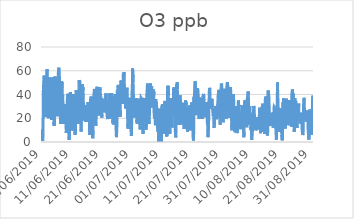
| Category | O3 |
|---|---|
| 01/06/2019 | 10.8 |
| 01/06/2019 | 8.7 |
| 01/06/2019 | 6.5 |
| 01/06/2019 | 5.7 |
| 01/06/2019 | 2.2 |
| 01/06/2019 | 1.1 |
| 01/06/2019 | 2 |
| 01/06/2019 | 4.7 |
| 01/06/2019 | 10.2 |
| 01/06/2019 | 24.5 |
| 01/06/2019 | 39.9 |
| 01/06/2019 | 45.3 |
| 01/06/2019 | 47.9 |
| 01/06/2019 | 48.5 |
| 01/06/2019 | 49.3 |
| 01/06/2019 | 52.4 |
| 01/06/2019 | 54.8 |
| 01/06/2019 | 55.9 |
| 01/06/2019 | 53.8 |
| 01/06/2019 | 48.4 |
| 01/06/2019 | 44.5 |
| 01/06/2019 | 40.9 |
| 01/06/2019 | 31.6 |
| 01/06/2019 | 30 |
| 02/06/2019 | 27 |
| 02/06/2019 | 22 |
| 02/06/2019 | 21 |
| 02/06/2019 | 21.1 |
| 02/06/2019 | 20.7 |
| 02/06/2019 | 22.1 |
| 02/06/2019 | 23.5 |
| 02/06/2019 | 24.1 |
| 02/06/2019 | 24.4 |
| 02/06/2019 | 24.2 |
| 02/06/2019 | 26 |
| 02/06/2019 | 36.6 |
| 02/06/2019 | 48 |
| 02/06/2019 | 52.4 |
| 02/06/2019 | 58.8 |
| 02/06/2019 | 58.8 |
| 02/06/2019 | 59.7 |
| 02/06/2019 | 61.3 |
| 02/06/2019 | 59.6 |
| 02/06/2019 | 56 |
| 02/06/2019 | 48.5 |
| 02/06/2019 | 42.3 |
| 02/06/2019 | 40 |
| 02/06/2019 | 36.1 |
| 03/06/2019 | 31.3 |
| 03/06/2019 | 27.7 |
| 03/06/2019 | 25.8 |
| 03/06/2019 | 24.1 |
| 03/06/2019 | 21.6 |
| 03/06/2019 | 20 |
| 03/06/2019 | 22.3 |
| 03/06/2019 | 24.3 |
| 03/06/2019 | 27.8 |
| 03/06/2019 | 39.9 |
| 03/06/2019 | 47.1 |
| 03/06/2019 | 52.8 |
| 03/06/2019 | 53.8 |
| 03/06/2019 | 52 |
| 03/06/2019 | 54.3 |
| 03/06/2019 | 51.5 |
| 03/06/2019 | 48.9 |
| 03/06/2019 | 30.4 |
| 03/06/2019 | 43.7 |
| 03/06/2019 | 52.3 |
| 03/06/2019 | 48.8 |
| 03/06/2019 | 41.8 |
| 03/06/2019 | 49.2 |
| 03/06/2019 | 46.1 |
| 04/06/2019 | 50.3 |
| 04/06/2019 | 44.8 |
| 04/06/2019 | 38.1 |
| 04/06/2019 | 29.6 |
| 04/06/2019 | 24.1 |
| 04/06/2019 | 18.5 |
| 04/06/2019 | 17.7 |
| 04/06/2019 | 23.3 |
| 04/06/2019 | 30.6 |
| 04/06/2019 | 35.6 |
| 04/06/2019 | 37.9 |
| 04/06/2019 | 42.6 |
| 04/06/2019 | 46 |
| 04/06/2019 | 46.6 |
| 04/06/2019 | 47.6 |
| 04/06/2019 | 50.6 |
| 04/06/2019 | 53.3 |
| 04/06/2019 | 54.4 |
| 04/06/2019 | 54 |
| 04/06/2019 | 50 |
| 04/06/2019 | 41.8 |
| 04/06/2019 | 35.7 |
| 04/06/2019 | 32.4 |
| 04/06/2019 | 27.1 |
| 05/06/2019 | 19.8 |
| 05/06/2019 | 15 |
| 05/06/2019 | 16.5 |
| 05/06/2019 | 13.5 |
| 05/06/2019 | 16.7 |
| 05/06/2019 | 19.6 |
| 05/06/2019 | 27 |
| 05/06/2019 | 35.8 |
| 05/06/2019 | 45.7 |
| 05/06/2019 | 50.5 |
| 05/06/2019 | 55.2 |
| 05/06/2019 | 51 |
| 05/06/2019 | 52.7 |
| 05/06/2019 | 51.8 |
| 05/06/2019 | 52.5 |
| 05/06/2019 | 52.1 |
| 05/06/2019 | 53.3 |
| 05/06/2019 | 52.5 |
| 05/06/2019 | 51.7 |
| 05/06/2019 | 51.5 |
| 05/06/2019 | 47.4 |
| 05/06/2019 | 40.5 |
| 05/06/2019 | 38.8 |
| 05/06/2019 | 38.7 |
| 06/06/2019 | 37.7 |
| 06/06/2019 | 34.8 |
| 06/06/2019 | 29.1 |
| 06/06/2019 | 26.3 |
| 06/06/2019 | 21.7 |
| 06/06/2019 | 22.3 |
| 06/06/2019 | 27.8 |
| 06/06/2019 | 37 |
| 06/06/2019 | 46.2 |
| 06/06/2019 | 49.2 |
| 06/06/2019 | 53.6 |
| 06/06/2019 | 56.1 |
| 06/06/2019 | 56.9 |
| 06/06/2019 | 59.5 |
| 06/06/2019 | 60.1 |
| 06/06/2019 | 60.2 |
| 06/06/2019 | 62.6 |
| 06/06/2019 | 60.4 |
| 06/06/2019 | 60.7 |
| 06/06/2019 | 61.1 |
| 06/06/2019 | 59.1 |
| 06/06/2019 | 52.4 |
| 06/06/2019 | 41.9 |
| 06/06/2019 | 39.4 |
| 07/06/2019 | 38.2 |
| 07/06/2019 | 38.1 |
| 07/06/2019 | 33.2 |
| 07/06/2019 | 26.7 |
| 07/06/2019 | 24.4 |
| 07/06/2019 | 18.9 |
| 07/06/2019 | 15.2 |
| 07/06/2019 | 18.5 |
| 07/06/2019 | 17.2 |
| 07/06/2019 | 29.5 |
| 07/06/2019 | 37.4 |
| 07/06/2019 | 44.7 |
| 07/06/2019 | 51.1 |
| 07/06/2019 | 50 |
| 07/06/2019 | 48.1 |
| 07/06/2019 | 45.7 |
| 07/06/2019 | 45 |
| 07/06/2019 | 49.7 |
| 07/06/2019 | 50.7 |
| 07/06/2019 | 48.4 |
| 07/06/2019 | 40.3 |
| 07/06/2019 | 41 |
| 07/06/2019 | 38.7 |
| 07/06/2019 | 39.7 |
| 08/06/2019 | 38.2 |
| 08/06/2019 | 34.2 |
| 08/06/2019 | 31.7 |
| 08/06/2019 | 22.2 |
| 08/06/2019 | 15.4 |
| 08/06/2019 | 16.1 |
| 08/06/2019 | 16.7 |
| 08/06/2019 | 15.6 |
| 08/06/2019 | 15.4 |
| 08/06/2019 | 15.2 |
| 08/06/2019 | 14.9 |
| 08/06/2019 | 15.7 |
| 08/06/2019 | 16.1 |
| 08/06/2019 | 16.3 |
| 08/06/2019 | 17.3 |
| 08/06/2019 | 19.5 |
| 08/06/2019 | 26.1 |
| 08/06/2019 | 29.2 |
| 08/06/2019 | 31.7 |
| 08/06/2019 | 29.3 |
| 08/06/2019 | 25.6 |
| 08/06/2019 | 24 |
| 08/06/2019 | 22.9 |
| 08/06/2019 | 23.3 |
| 09/06/2019 | 20.3 |
| 09/06/2019 | 17.9 |
| 09/06/2019 | 16 |
| 09/06/2019 | 12.6 |
| 09/06/2019 | 8.5 |
| 09/06/2019 | 7.6 |
| 09/06/2019 | 8 |
| 09/06/2019 | 12.8 |
| 09/06/2019 | 20 |
| 09/06/2019 | 23.7 |
| 09/06/2019 | 29.3 |
| 09/06/2019 | 31.6 |
| 09/06/2019 | 31.9 |
| 09/06/2019 | 34.4 |
| 09/06/2019 | 38.8 |
| 09/06/2019 | 40.6 |
| 09/06/2019 | 40.5 |
| 09/06/2019 | 40.8 |
| 09/06/2019 | 40.3 |
| 09/06/2019 | 38.5 |
| 09/06/2019 | 33.9 |
| 09/06/2019 | 28.3 |
| 09/06/2019 | 21.4 |
| 09/06/2019 | 20.1 |
| 10/06/2019 | 15.7 |
| 10/06/2019 | 9.5 |
| 10/06/2019 | 4.9 |
| 10/06/2019 | 4.1 |
| 10/06/2019 | 1.7 |
| 10/06/2019 | 4.4 |
| 10/06/2019 | 4.8 |
| 10/06/2019 | 6.3 |
| 10/06/2019 | 13.8 |
| 10/06/2019 | 13.5 |
| 10/06/2019 | 23.2 |
| 10/06/2019 | 33 |
| 10/06/2019 | 37.1 |
| 10/06/2019 | 38.8 |
| 10/06/2019 | 42 |
| 10/06/2019 | 41.2 |
| 10/06/2019 | 41.6 |
| 10/06/2019 | 41.9 |
| 10/06/2019 | 41.7 |
| 10/06/2019 | 35.3 |
| 10/06/2019 | 32.1 |
| 10/06/2019 | 35.6 |
| 10/06/2019 | 34.1 |
| 10/06/2019 | 32.9 |
| 11/06/2019 | 30.9 |
| 11/06/2019 | 23.7 |
| 11/06/2019 | 21.9 |
| 11/06/2019 | 24.7 |
| 11/06/2019 | 15.5 |
| 11/06/2019 | 9.6 |
| 11/06/2019 | 20.9 |
| 11/06/2019 | 21.2 |
| 11/06/2019 | 27.5 |
| 11/06/2019 | 29.4 |
| 11/06/2019 | 31.9 |
| 11/06/2019 | 34.8 |
| 11/06/2019 | 38.7 |
| 11/06/2019 | 38.7 |
| 11/06/2019 | 40.2 |
| 11/06/2019 | 40.2 |
| 11/06/2019 | 36.8 |
| 11/06/2019 | 36.6 |
| 11/06/2019 | 37.6 |
| 11/06/2019 | 36.1 |
| 11/06/2019 | 31.6 |
| 11/06/2019 | 26.1 |
| 11/06/2019 | 25 |
| 11/06/2019 | 20.9 |
| 12/06/2019 | 15.1 |
| 12/06/2019 | 15.2 |
| 12/06/2019 | 11.9 |
| 12/06/2019 | 7.8 |
| 12/06/2019 | 6.1 |
| 12/06/2019 | 5.3 |
| 12/06/2019 | 6.6 |
| 12/06/2019 | 10.1 |
| 12/06/2019 | 20.3 |
| 12/06/2019 | 29.2 |
| 12/06/2019 | 37.5 |
| 12/06/2019 | 39.7 |
| 12/06/2019 | 41 |
| 12/06/2019 | 41.6 |
| 12/06/2019 | 43.8 |
| 12/06/2019 | 40.9 |
| 12/06/2019 | 39.9 |
| 12/06/2019 | 39.4 |
| 12/06/2019 | 36.8 |
| 12/06/2019 | 36.5 |
| 12/06/2019 | 35.8 |
| 12/06/2019 | 33.9 |
| 12/06/2019 | 31.6 |
| 12/06/2019 | 34.2 |
| 13/06/2019 | 30.6 |
| 13/06/2019 | 29.9 |
| 13/06/2019 | 30.7 |
| 13/06/2019 | 24.2 |
| 13/06/2019 | 19 |
| 13/06/2019 | 15.3 |
| 13/06/2019 | 15.8 |
| 13/06/2019 | 20.2 |
| 13/06/2019 | 23.2 |
| 13/06/2019 | 26.9 |
| 13/06/2019 | 37.4 |
| 13/06/2019 | 41.3 |
| 13/06/2019 | 44.4 |
| 13/06/2019 | 52.2 |
| 13/06/2019 | 52.1 |
| 13/06/2019 | 50.2 |
| 13/06/2019 | 49.1 |
| 13/06/2019 | 51.7 |
| 13/06/2019 | 44.3 |
| 13/06/2019 | 39.3 |
| 13/06/2019 | 35.5 |
| 13/06/2019 | 31.5 |
| 13/06/2019 | 30.8 |
| 13/06/2019 | 28.1 |
| 14/06/2019 | 30.5 |
| 14/06/2019 | 27.4 |
| 14/06/2019 | 24.7 |
| 14/06/2019 | 19.7 |
| 14/06/2019 | 14.5 |
| 14/06/2019 | 8.9 |
| 14/06/2019 | 10.8 |
| 14/06/2019 | 18.4 |
| 14/06/2019 | 25.6 |
| 14/06/2019 | 27.1 |
| 14/06/2019 | 37.6 |
| 14/06/2019 | 34.8 |
| 14/06/2019 | 39.5 |
| 14/06/2019 | 40 |
| 14/06/2019 | 37.7 |
| 14/06/2019 | 46 |
| 14/06/2019 | 48.6 |
| 14/06/2019 | 42.3 |
| 14/06/2019 | 42.5 |
| 14/06/2019 | 46.3 |
| 14/06/2019 | 46.5 |
| 14/06/2019 | 44.1 |
| 14/06/2019 | 36.5 |
| 14/06/2019 | 34.7 |
| 15/06/2019 | 26.3 |
| 15/06/2019 | 33.1 |
| 15/06/2019 | 24.1 |
| 15/06/2019 | 19 |
| 15/06/2019 | 18.1 |
| 15/06/2019 | 23.2 |
| 15/06/2019 | 22.5 |
| 15/06/2019 | 20.3 |
| 15/06/2019 | 24.9 |
| 15/06/2019 | 29.5 |
| 15/06/2019 | 31.2 |
| 15/06/2019 | 31.2 |
| 15/06/2019 | 28.9 |
| 15/06/2019 | 23.1 |
| 15/06/2019 | 25.3 |
| 15/06/2019 | 24.7 |
| 15/06/2019 | 19.7 |
| 15/06/2019 | 17.8 |
| 15/06/2019 | 16.9 |
| 15/06/2019 | 18.7 |
| 15/06/2019 | 20.4 |
| 15/06/2019 | 24.8 |
| 15/06/2019 | 26.4 |
| 15/06/2019 | 26.6 |
| 16/06/2019 | 21.9 |
| 16/06/2019 | 21.1 |
| 16/06/2019 | 19.3 |
| 16/06/2019 | 27.9 |
| 16/06/2019 | 28.4 |
| 16/06/2019 | 20.2 |
| 16/06/2019 | 17.1 |
| 16/06/2019 | 22.9 |
| 16/06/2019 | 25.1 |
| 16/06/2019 | 30.1 |
| 16/06/2019 | 28.7 |
| 16/06/2019 | 30.4 |
| 16/06/2019 | 31.8 |
| 16/06/2019 | 33.6 |
| 16/06/2019 | 32.1 |
| 16/06/2019 | 32.4 |
| 16/06/2019 | 32.5 |
| 16/06/2019 | 32.3 |
| 16/06/2019 | 32.8 |
| 16/06/2019 | 32.1 |
| 16/06/2019 | 29 |
| 16/06/2019 | 24 |
| 16/06/2019 | 23.4 |
| 16/06/2019 | 28.7 |
| 17/06/2019 | 30.4 |
| 17/06/2019 | 20.2 |
| 17/06/2019 | 9 |
| 17/06/2019 | 5.9 |
| 17/06/2019 | 5.2 |
| 17/06/2019 | 7.7 |
| 17/06/2019 | 9.4 |
| 17/06/2019 | 13.6 |
| 17/06/2019 | 23.4 |
| 17/06/2019 | 31.6 |
| 17/06/2019 | 36.1 |
| 17/06/2019 | 34 |
| 17/06/2019 | 35 |
| 17/06/2019 | 35.8 |
| 17/06/2019 | 38.3 |
| 17/06/2019 | 37.6 |
| 17/06/2019 | 36 |
| 17/06/2019 | 37.8 |
| 17/06/2019 | 37.6 |
| 17/06/2019 | 36.5 |
| 17/06/2019 | 32.9 |
| 17/06/2019 | 30.3 |
| 17/06/2019 | 22.5 |
| 17/06/2019 | 18.6 |
| 18/06/2019 | 12 |
| 18/06/2019 | 11.4 |
| 18/06/2019 | 9.3 |
| 18/06/2019 | 3.1 |
| 18/06/2019 | 2.3 |
| 18/06/2019 | 3.7 |
| 18/06/2019 | 10 |
| 18/06/2019 | 19.2 |
| 18/06/2019 | 22.4 |
| 18/06/2019 | 29.2 |
| 18/06/2019 | 31.9 |
| 18/06/2019 | 35.6 |
| 18/06/2019 | 38.9 |
| 18/06/2019 | 39.1 |
| 18/06/2019 | 41.1 |
| 18/06/2019 | 42.6 |
| 18/06/2019 | 43.2 |
| 18/06/2019 | 44.7 |
| 18/06/2019 | 44.5 |
| 18/06/2019 | 43.5 |
| 18/06/2019 | 39 |
| 18/06/2019 | 29.1 |
| 18/06/2019 | 24.5 |
| 18/06/2019 | 20.8 |
| 19/06/2019 | 20.8 |
| 19/06/2019 | 19.7 |
| 19/06/2019 | 17.9 |
| 19/06/2019 | 16 |
| 19/06/2019 | 13.7 |
| 19/06/2019 | 13.6 |
| 19/06/2019 | 14.8 |
| 19/06/2019 | 19.3 |
| 19/06/2019 | 28.2 |
| 19/06/2019 | 38.6 |
| 19/06/2019 | 41.3 |
| 19/06/2019 | 42.7 |
| 19/06/2019 | 45.4 |
| 19/06/2019 | 45.7 |
| 19/06/2019 | 46.1 |
| 19/06/2019 | 46.5 |
| 19/06/2019 | 43.6 |
| 19/06/2019 | 43.9 |
| 19/06/2019 | 46.2 |
| 19/06/2019 | 44.1 |
| 19/06/2019 | 40.4 |
| 19/06/2019 | 35.4 |
| 19/06/2019 | 31.3 |
| 19/06/2019 | 29.3 |
| 20/06/2019 | 25.9 |
| 20/06/2019 | 24.1 |
| 20/06/2019 | 23.9 |
| 20/06/2019 | 24.1 |
| 20/06/2019 | 22.3 |
| 20/06/2019 | 24.8 |
| 20/06/2019 | 23.6 |
| 20/06/2019 | 26.8 |
| 20/06/2019 | 37.5 |
| 20/06/2019 | 36.6 |
| 20/06/2019 | 37.8 |
| 20/06/2019 | 44.6 |
| 20/06/2019 | 43.7 |
| 20/06/2019 | 46.1 |
| 20/06/2019 | 42.3 |
| 20/06/2019 | 39.7 |
| 20/06/2019 | 41.2 |
| 20/06/2019 | 41.6 |
| 20/06/2019 | 39.5 |
| 20/06/2019 | 40.7 |
| 20/06/2019 | 34.9 |
| 20/06/2019 | 28.1 |
| 20/06/2019 | 29.9 |
| 20/06/2019 | 29.3 |
| 21/06/2019 | 34.8 |
| 21/06/2019 | 31.5 |
| 21/06/2019 | 27.1 |
| 21/06/2019 | 23.8 |
| 21/06/2019 | 22.1 |
| 21/06/2019 | 20.5 |
| 21/06/2019 | 22.5 |
| 21/06/2019 | 23.8 |
| 21/06/2019 | 26.6 |
| 21/06/2019 | 29.5 |
| 21/06/2019 | 30.2 |
| 21/06/2019 | 30.3 |
| 21/06/2019 | 27.4 |
| 21/06/2019 | 26 |
| 21/06/2019 | 26.1 |
| 21/06/2019 | 26.4 |
| 21/06/2019 | 28.9 |
| 21/06/2019 | 35.6 |
| 21/06/2019 | 34.5 |
| 21/06/2019 | 36.5 |
| 21/06/2019 | 32.7 |
| 21/06/2019 | 25 |
| 21/06/2019 | 27.5 |
| 21/06/2019 | 29 |
| 22/06/2019 | 31 |
| 22/06/2019 | 31 |
| 22/06/2019 | 31.6 |
| 22/06/2019 | 32.2 |
| 22/06/2019 | 34 |
| 22/06/2019 | 33.8 |
| 22/06/2019 | 31.3 |
| 22/06/2019 | 30.6 |
| 22/06/2019 | 33.4 |
| 22/06/2019 | 31.9 |
| 22/06/2019 | 32 |
| 22/06/2019 | 36.2 |
| 22/06/2019 | 37.1 |
| 22/06/2019 | 39.7 |
| 22/06/2019 | 40.9 |
| 22/06/2019 | 40.7 |
| 22/06/2019 | 29.1 |
| 22/06/2019 | 27.8 |
| 22/06/2019 | 24.3 |
| 22/06/2019 | 25.6 |
| 22/06/2019 | 34 |
| 22/06/2019 | 28.7 |
| 22/06/2019 | 27.5 |
| 22/06/2019 | 26.1 |
| 23/06/2019 | 23.6 |
| 23/06/2019 | 21.2 |
| 23/06/2019 | 22.2 |
| 23/06/2019 | 21.8 |
| 23/06/2019 | 19.3 |
| 23/06/2019 | 19.6 |
| 23/06/2019 | 20.1 |
| 23/06/2019 | 23.2 |
| 23/06/2019 | 26.7 |
| 23/06/2019 | 29.7 |
| 23/06/2019 | 31.3 |
| 23/06/2019 | 32.7 |
| 23/06/2019 | 33.9 |
| 23/06/2019 | 34.7 |
| 23/06/2019 | 35.2 |
| 23/06/2019 | 37.3 |
| 23/06/2019 | 40.9 |
| 23/06/2019 | 41.4 |
| 23/06/2019 | 39.8 |
| 23/06/2019 | 40.3 |
| 23/06/2019 | 39.1 |
| 23/06/2019 | 34.1 |
| 23/06/2019 | 30.1 |
| 23/06/2019 | 26.4 |
| 24/06/2019 | 19.5 |
| 24/06/2019 | 23.5 |
| 24/06/2019 | 23.8 |
| 24/06/2019 | 27.1 |
| 24/06/2019 | 31.5 |
| 24/06/2019 | 26.6 |
| 24/06/2019 | 22.6 |
| 24/06/2019 | 27.1 |
| 24/06/2019 | 29.1 |
| 24/06/2019 | 27.7 |
| 24/06/2019 | 24.6 |
| 24/06/2019 | 30.1 |
| 24/06/2019 | 40 |
| 24/06/2019 | 41 |
| 24/06/2019 | 34.9 |
| 24/06/2019 | 34.7 |
| 24/06/2019 | 35.4 |
| 24/06/2019 | 36.2 |
| 24/06/2019 | 32.1 |
| 24/06/2019 | 31.9 |
| 24/06/2019 | 32.5 |
| 24/06/2019 | 24.2 |
| 24/06/2019 | 20.3 |
| 24/06/2019 | 16.9 |
| 25/06/2019 | 18.6 |
| 25/06/2019 | 15.5 |
| 25/06/2019 | 16.9 |
| 25/06/2019 | 15.9 |
| 25/06/2019 | 14.7 |
| 25/06/2019 | 14.1 |
| 25/06/2019 | 15.7 |
| 25/06/2019 | 21.9 |
| 25/06/2019 | 25.8 |
| 25/06/2019 | 29.3 |
| 25/06/2019 | 33 |
| 25/06/2019 | 35.3 |
| 25/06/2019 | 37.1 |
| 25/06/2019 | 38.4 |
| 25/06/2019 | 37.1 |
| 25/06/2019 | 36.9 |
| 25/06/2019 | 38.4 |
| 25/06/2019 | 40.4 |
| 25/06/2019 | 41.1 |
| 25/06/2019 | 38.9 |
| 25/06/2019 | 36.9 |
| 25/06/2019 | 24.3 |
| 25/06/2019 | 17.7 |
| 25/06/2019 | 15 |
| 26/06/2019 | 13.3 |
| 26/06/2019 | 10.6 |
| 26/06/2019 | 7.9 |
| 26/06/2019 | 5.3 |
| 26/06/2019 | 4.1 |
| 26/06/2019 | 6.8 |
| 26/06/2019 | 8.5 |
| 26/06/2019 | 11.3 |
| 26/06/2019 | 14.9 |
| 26/06/2019 | 33.7 |
| 26/06/2019 | 39.3 |
| 26/06/2019 | 43 |
| 26/06/2019 | 43.3 |
| 26/06/2019 | 43.3 |
| 26/06/2019 | 43.1 |
| 26/06/2019 | 43.4 |
| 26/06/2019 | 44.2 |
| 26/06/2019 | 46.4 |
| 26/06/2019 | 48.1 |
| 26/06/2019 | 45.5 |
| 26/06/2019 | 40.5 |
| 26/06/2019 | 28.1 |
| 26/06/2019 | 32.1 |
| 26/06/2019 | 29.5 |
| 27/06/2019 | 30 |
| 27/06/2019 | 33.4 |
| 27/06/2019 | 34.4 |
| 27/06/2019 | 31.6 |
| 27/06/2019 | 28.7 |
| 27/06/2019 | 25.7 |
| 27/06/2019 | 21.3 |
| 27/06/2019 | 26.1 |
| 27/06/2019 | 23.9 |
| 27/06/2019 | 24.4 |
| 27/06/2019 | 21.4 |
| 27/06/2019 | 26.4 |
| 27/06/2019 | 38.1 |
| 27/06/2019 | 41.2 |
| 27/06/2019 | 45.6 |
| 27/06/2019 | 49.6 |
| 27/06/2019 | 51.8 |
| 27/06/2019 | 51.4 |
| 27/06/2019 | 50.5 |
| 27/06/2019 | 46.9 |
| 27/06/2019 | 41.5 |
| 27/06/2019 | 35.8 |
| 27/06/2019 | 34.5 |
| 27/06/2019 | 34.2 |
| 28/06/2019 | 32.1 |
| 28/06/2019 | 32.7 |
| 28/06/2019 | 33 |
| 28/06/2019 | 42.6 |
| 28/06/2019 | 35.6 |
| 28/06/2019 | 36 |
| 28/06/2019 | 33.7 |
| 28/06/2019 | 32.9 |
| 28/06/2019 | 36.2 |
| 28/06/2019 | 40 |
| 28/06/2019 | 48.7 |
| 28/06/2019 | 57.1 |
| 28/06/2019 | 56.8 |
| 28/06/2019 | 56.8 |
| 28/06/2019 | 55.5 |
| 28/06/2019 | 54.7 |
| 28/06/2019 | 57 |
| 28/06/2019 | 59 |
| 28/06/2019 | 56.9 |
| 28/06/2019 | 55 |
| 28/06/2019 | 49.3 |
| 28/06/2019 | 45.7 |
| 28/06/2019 | 43.7 |
| 28/06/2019 | 38.7 |
| 29/06/2019 | 34.3 |
| 29/06/2019 | 32.3 |
| 29/06/2019 | 36.5 |
| 29/06/2019 | 35.9 |
| 29/06/2019 | 35 |
| 29/06/2019 | 31.4 |
| 29/06/2019 | 28.3 |
| 29/06/2019 | 28.8 |
| 29/06/2019 | 35.2 |
| 29/06/2019 | 33.8 |
| 29/06/2019 | 38.4 |
| 29/06/2019 | 42.3 |
| 29/06/2019 | 41.8 |
| 29/06/2019 | 42.3 |
| 29/06/2019 | 37.1 |
| 29/06/2019 | 37.7 |
| 29/06/2019 | 44.4 |
| 29/06/2019 | 45.7 |
| 29/06/2019 | 44.2 |
| 29/06/2019 | 35.7 |
| 29/06/2019 | 35.1 |
| 29/06/2019 | 33.1 |
| 29/06/2019 | 20.5 |
| 29/06/2019 | 19.4 |
| 30/06/2019 | 12.9 |
| 30/06/2019 | 14.6 |
| 30/06/2019 | 12.9 |
| 30/06/2019 | 11.1 |
| 30/06/2019 | 12.6 |
| 30/06/2019 | 17.4 |
| 30/06/2019 | 19.3 |
| 30/06/2019 | 19.4 |
| 30/06/2019 | 24.5 |
| 30/06/2019 | 31.4 |
| 30/06/2019 | 33.3 |
| 30/06/2019 | 35.5 |
| 30/06/2019 | 34.8 |
| 30/06/2019 | 34.8 |
| 30/06/2019 | 36.2 |
| 30/06/2019 | 37.2 |
| 30/06/2019 | 35.1 |
| 30/06/2019 | 35.8 |
| 30/06/2019 | 36 |
| 30/06/2019 | 33.1 |
| 30/06/2019 | 28.6 |
| 30/06/2019 | 23.8 |
| 30/06/2019 | 20.9 |
| 30/06/2019 | 18.3 |
| 01/07/2019 | 12.4 |
| 01/07/2019 | 12.5 |
| 01/07/2019 | 9.4 |
| 01/07/2019 | 8.4 |
| 01/07/2019 | 7.4 |
| 01/07/2019 | 5.2 |
| 01/07/2019 | 8.9 |
| 01/07/2019 | 13.1 |
| 01/07/2019 | 27.8 |
| 01/07/2019 | 32.5 |
| 01/07/2019 | 39.6 |
| 01/07/2019 | 42.9 |
| 01/07/2019 | 44.5 |
| 01/07/2019 | 47.5 |
| 01/07/2019 | 54.4 |
| 01/07/2019 | 62 |
| 01/07/2019 | 55.4 |
| 01/07/2019 | 56.7 |
| 01/07/2019 | 56.1 |
| 01/07/2019 | 50.5 |
| 01/07/2019 | 43.7 |
| 01/07/2019 | 44.2 |
| 01/07/2019 | 43 |
| 01/07/2019 | 36.7 |
| 02/07/2019 | 29.6 |
| 02/07/2019 | 27.1 |
| 02/07/2019 | 24.9 |
| 02/07/2019 | 23.6 |
| 02/07/2019 | 20.7 |
| 02/07/2019 | 25.3 |
| 02/07/2019 | 26.4 |
| 02/07/2019 | 25.5 |
| 02/07/2019 | 25.2 |
| 02/07/2019 | 33.9 |
| 02/07/2019 | 35 |
| 02/07/2019 | 33.8 |
| 02/07/2019 | 33.8 |
| 02/07/2019 | 33.4 |
| 02/07/2019 | 34.3 |
| 02/07/2019 | 35 |
| 02/07/2019 | 36.9 |
| 02/07/2019 | 37.6 |
| 02/07/2019 | 35.1 |
| 02/07/2019 | 34 |
| 02/07/2019 | 32.4 |
| 02/07/2019 | 26.3 |
| 02/07/2019 | 25.6 |
| 02/07/2019 | 24.7 |
| 03/07/2019 | 25.2 |
| 03/07/2019 | 19.6 |
| 03/07/2019 | 17.3 |
| 03/07/2019 | 18.3 |
| 03/07/2019 | 15.5 |
| 03/07/2019 | 16.3 |
| 03/07/2019 | 16.3 |
| 03/07/2019 | 19.7 |
| 03/07/2019 | 17.6 |
| 03/07/2019 | 25.8 |
| 03/07/2019 | 32.1 |
| 03/07/2019 | 35.1 |
| 03/07/2019 | 36.5 |
| 03/07/2019 | 35.2 |
| 03/07/2019 | 26.5 |
| 03/07/2019 | 35.3 |
| 03/07/2019 | 36.2 |
| 03/07/2019 | 31.9 |
| 03/07/2019 | 25.8 |
| 03/07/2019 | 29.5 |
| 03/07/2019 | 25.4 |
| 03/07/2019 | 21.2 |
| 03/07/2019 | 21.9 |
| 03/07/2019 | 16.6 |
| 04/07/2019 | 14.5 |
| 04/07/2019 | 16.9 |
| 04/07/2019 | 16 |
| 04/07/2019 | 15.3 |
| 04/07/2019 | 10.6 |
| 04/07/2019 | 10.4 |
| 04/07/2019 | 10.3 |
| 04/07/2019 | 14.4 |
| 04/07/2019 | 19.9 |
| 04/07/2019 | 28 |
| 04/07/2019 | 32.8 |
| 04/07/2019 | 35.2 |
| 04/07/2019 | 37.1 |
| 04/07/2019 | 37.1 |
| 04/07/2019 | 37.4 |
| 04/07/2019 | 37.6 |
| 04/07/2019 | 36.7 |
| 04/07/2019 | 36.2 |
| 04/07/2019 | 34.4 |
| 04/07/2019 | 35.3 |
| 04/07/2019 | 29.9 |
| 04/07/2019 | 26.2 |
| 04/07/2019 | 18.9 |
| 04/07/2019 | 17.3 |
| 05/07/2019 | 12.7 |
| 05/07/2019 | 10.2 |
| 05/07/2019 | 11 |
| 05/07/2019 | 8.8 |
| 05/07/2019 | 6.9 |
| 05/07/2019 | 9 |
| 05/07/2019 | 16.7 |
| 05/07/2019 | 20.7 |
| 05/07/2019 | 25.4 |
| 05/07/2019 | 29.3 |
| 05/07/2019 | 32.2 |
| 05/07/2019 | 35.5 |
| 05/07/2019 | 36.2 |
| 05/07/2019 | 36 |
| 05/07/2019 | 35.1 |
| 05/07/2019 | 35.4 |
| 05/07/2019 | 37.1 |
| 05/07/2019 | 36.3 |
| 05/07/2019 | 35.3 |
| 05/07/2019 | 34.7 |
| 05/07/2019 | 28.6 |
| 05/07/2019 | 26 |
| 05/07/2019 | 25.5 |
| 05/07/2019 | 20.5 |
| 06/07/2019 | 18.2 |
| 06/07/2019 | 16.3 |
| 06/07/2019 | 13.9 |
| 06/07/2019 | 13.4 |
| 06/07/2019 | 10.4 |
| 06/07/2019 | 14.9 |
| 06/07/2019 | 13.4 |
| 06/07/2019 | 16.2 |
| 06/07/2019 | 25.4 |
| 06/07/2019 | 35.9 |
| 06/07/2019 | 38.4 |
| 06/07/2019 | 40.8 |
| 06/07/2019 | 42.7 |
| 06/07/2019 | 43.1 |
| 06/07/2019 | 45.5 |
| 06/07/2019 | 47.6 |
| 06/07/2019 | 49.2 |
| 06/07/2019 | 46.6 |
| 06/07/2019 | 45.2 |
| 06/07/2019 | 44.9 |
| 06/07/2019 | 38.1 |
| 06/07/2019 | 32.5 |
| 06/07/2019 | 24.5 |
| 06/07/2019 | 24.4 |
| 07/07/2019 | 24 |
| 07/07/2019 | 20.8 |
| 07/07/2019 | 17.8 |
| 07/07/2019 | 17 |
| 07/07/2019 | 15.2 |
| 07/07/2019 | 14.9 |
| 07/07/2019 | 16.9 |
| 07/07/2019 | 21 |
| 07/07/2019 | 27.5 |
| 07/07/2019 | 31.3 |
| 07/07/2019 | 35.7 |
| 07/07/2019 | 38.8 |
| 07/07/2019 | 40.9 |
| 07/07/2019 | 41.6 |
| 07/07/2019 | 45.6 |
| 07/07/2019 | 47.2 |
| 07/07/2019 | 49.3 |
| 07/07/2019 | 50.1 |
| 07/07/2019 | 48.5 |
| 07/07/2019 | 43.6 |
| 07/07/2019 | 39 |
| 07/07/2019 | 35.8 |
| 07/07/2019 | 38.7 |
| 07/07/2019 | 37.9 |
| 08/07/2019 | 32.8 |
| 08/07/2019 | 46.8 |
| 08/07/2019 | 47.3 |
| 08/07/2019 | 45.6 |
| 08/07/2019 | 36.9 |
| 08/07/2019 | 30.5 |
| 08/07/2019 | 31.1 |
| 08/07/2019 | 29 |
| 08/07/2019 | 30.4 |
| 08/07/2019 | 32 |
| 08/07/2019 | 36.5 |
| 08/07/2019 | 41.2 |
| 08/07/2019 | 43.3 |
| 08/07/2019 | 43 |
| 08/07/2019 | 44.1 |
| 08/07/2019 | 44.3 |
| 08/07/2019 | 39.5 |
| 08/07/2019 | 36.4 |
| 08/07/2019 | 42.5 |
| 08/07/2019 | 38.3 |
| 08/07/2019 | 30.8 |
| 08/07/2019 | 26.2 |
| 08/07/2019 | 23.4 |
| 08/07/2019 | 22.3 |
| 09/07/2019 | 20.6 |
| 09/07/2019 | 23.7 |
| 09/07/2019 | 23.4 |
| 09/07/2019 | 25.5 |
| 09/07/2019 | 19.5 |
| 09/07/2019 | 21 |
| 09/07/2019 | 20.4 |
| 09/07/2019 | 19.7 |
| 09/07/2019 | 14.2 |
| 09/07/2019 | 27 |
| 09/07/2019 | 36.1 |
| 09/07/2019 | 26.8 |
| 09/07/2019 | 23.9 |
| 09/07/2019 | 26.1 |
| 09/07/2019 | 29.6 |
| 09/07/2019 | 32.6 |
| 09/07/2019 | 33.8 |
| 09/07/2019 | 33.3 |
| 09/07/2019 | 29.6 |
| 09/07/2019 | 25.2 |
| 09/07/2019 | 27.5 |
| 09/07/2019 | 23.5 |
| 09/07/2019 | 17.2 |
| 09/07/2019 | 24.5 |
| 10/07/2019 | 28.5 |
| 10/07/2019 | 16.4 |
| 10/07/2019 | 11.3 |
| 10/07/2019 | 10.6 |
| 10/07/2019 | 10.4 |
| 10/07/2019 | 8.5 |
| 10/07/2019 | 8.8 |
| 10/07/2019 | 11 |
| 10/07/2019 | 14.6 |
| 10/07/2019 | 17.8 |
| 10/07/2019 | 0 |
| 10/07/2019 | 0 |
| 10/07/2019 | 0 |
| 10/07/2019 | 0 |
| 10/07/2019 | 0 |
| 10/07/2019 | 0 |
| 10/07/2019 | 0 |
| 10/07/2019 | 25.8 |
| 10/07/2019 | 26.2 |
| 10/07/2019 | 28 |
| 10/07/2019 | 22.2 |
| 10/07/2019 | 14.7 |
| 10/07/2019 | 16.1 |
| 10/07/2019 | 14.6 |
| 11/07/2019 | 14.5 |
| 11/07/2019 | 18.5 |
| 11/07/2019 | 19.4 |
| 11/07/2019 | 19.2 |
| 11/07/2019 | 22 |
| 11/07/2019 | 22.5 |
| 11/07/2019 | 23 |
| 11/07/2019 | 23.3 |
| 11/07/2019 | 0 |
| 11/07/2019 | 0 |
| 11/07/2019 | 0 |
| 11/07/2019 | 0 |
| 11/07/2019 | 0 |
| 11/07/2019 | 30.2 |
| 11/07/2019 | 29.6 |
| 11/07/2019 | 29.8 |
| 11/07/2019 | 30.2 |
| 11/07/2019 | 31.7 |
| 11/07/2019 | 31.2 |
| 11/07/2019 | 29.7 |
| 11/07/2019 | 31.8 |
| 11/07/2019 | 25.7 |
| 11/07/2019 | 21.1 |
| 11/07/2019 | 18.8 |
| 12/07/2019 | 15.2 |
| 12/07/2019 | 12.2 |
| 12/07/2019 | 12.4 |
| 12/07/2019 | 10.6 |
| 12/07/2019 | 13.1 |
| 12/07/2019 | 9.2 |
| 12/07/2019 | 7 |
| 12/07/2019 | 11.3 |
| 12/07/2019 | 16.9 |
| 12/07/2019 | 24.5 |
| 12/07/2019 | 30.8 |
| 12/07/2019 | 33.4 |
| 12/07/2019 | 33.6 |
| 12/07/2019 | 33.4 |
| 12/07/2019 | 33.4 |
| 12/07/2019 | 34.6 |
| 12/07/2019 | 34.2 |
| 12/07/2019 | 32.3 |
| 12/07/2019 | 28.9 |
| 12/07/2019 | 27.7 |
| 12/07/2019 | 22.6 |
| 12/07/2019 | 21.1 |
| 12/07/2019 | 19.9 |
| 12/07/2019 | 13 |
| 13/07/2019 | 10.8 |
| 13/07/2019 | 11.4 |
| 13/07/2019 | 6.3 |
| 13/07/2019 | 5.9 |
| 13/07/2019 | 4.6 |
| 13/07/2019 | 7.6 |
| 13/07/2019 | 5.6 |
| 13/07/2019 | 10.7 |
| 13/07/2019 | 17.9 |
| 13/07/2019 | 24.4 |
| 13/07/2019 | 32.2 |
| 13/07/2019 | 41.6 |
| 13/07/2019 | 43.2 |
| 13/07/2019 | 42.1 |
| 13/07/2019 | 39.6 |
| 13/07/2019 | 47.4 |
| 13/07/2019 | 39.2 |
| 13/07/2019 | 39.2 |
| 13/07/2019 | 33.1 |
| 13/07/2019 | 32.5 |
| 13/07/2019 | 26.4 |
| 13/07/2019 | 24.1 |
| 13/07/2019 | 23 |
| 13/07/2019 | 22.6 |
| 14/07/2019 | 18.2 |
| 14/07/2019 | 17.6 |
| 14/07/2019 | 15.3 |
| 14/07/2019 | 13.3 |
| 14/07/2019 | 10.1 |
| 14/07/2019 | 7 |
| 14/07/2019 | 8.9 |
| 14/07/2019 | 17.8 |
| 14/07/2019 | 23.6 |
| 14/07/2019 | 28.6 |
| 14/07/2019 | 30.2 |
| 14/07/2019 | 28.2 |
| 14/07/2019 | 36.5 |
| 14/07/2019 | 30.8 |
| 14/07/2019 | 34 |
| 14/07/2019 | 34.8 |
| 14/07/2019 | 36.9 |
| 14/07/2019 | 33.8 |
| 14/07/2019 | 36 |
| 14/07/2019 | 31.4 |
| 14/07/2019 | 25.7 |
| 14/07/2019 | 19.7 |
| 14/07/2019 | 17.6 |
| 14/07/2019 | 13.3 |
| 15/07/2019 | 12.2 |
| 15/07/2019 | 14.4 |
| 15/07/2019 | 22.5 |
| 15/07/2019 | 25.9 |
| 15/07/2019 | 26.8 |
| 15/07/2019 | 26 |
| 15/07/2019 | 24.7 |
| 15/07/2019 | 24 |
| 15/07/2019 | 27.6 |
| 15/07/2019 | 34.1 |
| 15/07/2019 | 35.8 |
| 15/07/2019 | 38.9 |
| 15/07/2019 | 44 |
| 15/07/2019 | 45.2 |
| 15/07/2019 | 43.6 |
| 15/07/2019 | 41 |
| 15/07/2019 | 42.6 |
| 15/07/2019 | 46.3 |
| 15/07/2019 | 42.9 |
| 15/07/2019 | 41.2 |
| 15/07/2019 | 36.7 |
| 15/07/2019 | 33.4 |
| 15/07/2019 | 23.8 |
| 15/07/2019 | 22.7 |
| 16/07/2019 | 19.3 |
| 16/07/2019 | 15.1 |
| 16/07/2019 | 8.8 |
| 16/07/2019 | 8.6 |
| 16/07/2019 | 6.9 |
| 16/07/2019 | 3.9 |
| 16/07/2019 | 5.3 |
| 16/07/2019 | 10.4 |
| 16/07/2019 | 19.7 |
| 16/07/2019 | 29.9 |
| 16/07/2019 | 35.9 |
| 16/07/2019 | 37.4 |
| 16/07/2019 | 43.5 |
| 16/07/2019 | 48.4 |
| 16/07/2019 | 44.7 |
| 16/07/2019 | 46.3 |
| 16/07/2019 | 47.3 |
| 16/07/2019 | 50.3 |
| 16/07/2019 | 47.5 |
| 16/07/2019 | 38.3 |
| 16/07/2019 | 36.9 |
| 16/07/2019 | 33.7 |
| 16/07/2019 | 30.9 |
| 16/07/2019 | 29.4 |
| 17/07/2019 | 27.7 |
| 17/07/2019 | 28.3 |
| 17/07/2019 | 25.1 |
| 17/07/2019 | 25.5 |
| 17/07/2019 | 22.4 |
| 17/07/2019 | 14.4 |
| 17/07/2019 | 14.7 |
| 17/07/2019 | 16.1 |
| 17/07/2019 | 19.3 |
| 17/07/2019 | 23.2 |
| 17/07/2019 | 25.3 |
| 17/07/2019 | 33.2 |
| 17/07/2019 | 34.7 |
| 17/07/2019 | 34.7 |
| 17/07/2019 | 37.4 |
| 17/07/2019 | 38.4 |
| 17/07/2019 | 38.7 |
| 17/07/2019 | 39.3 |
| 17/07/2019 | 37.5 |
| 17/07/2019 | 35.4 |
| 17/07/2019 | 28.6 |
| 17/07/2019 | 24.9 |
| 17/07/2019 | 19.4 |
| 17/07/2019 | 17.3 |
| 18/07/2019 | 16.8 |
| 18/07/2019 | 15.4 |
| 18/07/2019 | 15.7 |
| 18/07/2019 | 18.6 |
| 18/07/2019 | 17.3 |
| 18/07/2019 | 14.8 |
| 18/07/2019 | 18.3 |
| 18/07/2019 | 20.6 |
| 18/07/2019 | 25.8 |
| 18/07/2019 | 26.8 |
| 18/07/2019 | 27.2 |
| 18/07/2019 | 27.7 |
| 18/07/2019 | 27.3 |
| 18/07/2019 | 27.9 |
| 18/07/2019 | 29 |
| 18/07/2019 | 32.1 |
| 18/07/2019 | 33 |
| 18/07/2019 | 31.4 |
| 18/07/2019 | 32.5 |
| 18/07/2019 | 32.1 |
| 18/07/2019 | 27.9 |
| 18/07/2019 | 25.1 |
| 18/07/2019 | 21.7 |
| 18/07/2019 | 17.4 |
| 19/07/2019 | 14.2 |
| 19/07/2019 | 10.9 |
| 19/07/2019 | 11.6 |
| 19/07/2019 | 13.7 |
| 19/07/2019 | 13.6 |
| 19/07/2019 | 14 |
| 19/07/2019 | 14.5 |
| 19/07/2019 | 23.9 |
| 19/07/2019 | 29.1 |
| 19/07/2019 | 30.8 |
| 19/07/2019 | 30.3 |
| 19/07/2019 | 30.7 |
| 19/07/2019 | 33.4 |
| 19/07/2019 | 35.2 |
| 19/07/2019 | 32.6 |
| 19/07/2019 | 32.8 |
| 19/07/2019 | 32.7 |
| 19/07/2019 | 33.8 |
| 19/07/2019 | 31.1 |
| 19/07/2019 | 28.7 |
| 19/07/2019 | 24.8 |
| 19/07/2019 | 17.5 |
| 19/07/2019 | 15.8 |
| 19/07/2019 | 21 |
| 20/07/2019 | 16.8 |
| 20/07/2019 | 12.9 |
| 20/07/2019 | 14.2 |
| 20/07/2019 | 15.7 |
| 20/07/2019 | 11.7 |
| 20/07/2019 | 8.6 |
| 20/07/2019 | 10.8 |
| 20/07/2019 | 15.9 |
| 20/07/2019 | 21.8 |
| 20/07/2019 | 23.1 |
| 20/07/2019 | 23.2 |
| 20/07/2019 | 24.9 |
| 20/07/2019 | 27.8 |
| 20/07/2019 | 28.5 |
| 20/07/2019 | 29.6 |
| 20/07/2019 | 28.2 |
| 20/07/2019 | 27.8 |
| 20/07/2019 | 27.9 |
| 20/07/2019 | 29.8 |
| 20/07/2019 | 30.7 |
| 20/07/2019 | 26.6 |
| 20/07/2019 | 20.9 |
| 20/07/2019 | 21.4 |
| 20/07/2019 | 21.9 |
| 21/07/2019 | 18.9 |
| 21/07/2019 | 16 |
| 21/07/2019 | 14.2 |
| 21/07/2019 | 11.6 |
| 21/07/2019 | 11.2 |
| 21/07/2019 | 9.8 |
| 21/07/2019 | 10.3 |
| 21/07/2019 | 9.9 |
| 21/07/2019 | 13 |
| 21/07/2019 | 16.4 |
| 21/07/2019 | 21.7 |
| 21/07/2019 | 28.9 |
| 21/07/2019 | 30.5 |
| 21/07/2019 | 31.3 |
| 21/07/2019 | 31.6 |
| 21/07/2019 | 32 |
| 21/07/2019 | 33.4 |
| 21/07/2019 | 33.4 |
| 21/07/2019 | 32.7 |
| 21/07/2019 | 30 |
| 21/07/2019 | 24.3 |
| 21/07/2019 | 20.6 |
| 21/07/2019 | 16.9 |
| 21/07/2019 | 14.3 |
| 22/07/2019 | 12.2 |
| 22/07/2019 | 6.2 |
| 22/07/2019 | 4.1 |
| 22/07/2019 | 4.7 |
| 22/07/2019 | 4.6 |
| 22/07/2019 | 1.3 |
| 22/07/2019 | 4.6 |
| 22/07/2019 | 9.2 |
| 22/07/2019 | 18.7 |
| 22/07/2019 | 26.1 |
| 22/07/2019 | 38.1 |
| 22/07/2019 | 23.9 |
| 22/07/2019 | 32.5 |
| 22/07/2019 | 35.4 |
| 22/07/2019 | 40.4 |
| 22/07/2019 | 44.5 |
| 22/07/2019 | 46.3 |
| 22/07/2019 | 47.8 |
| 22/07/2019 | 48.9 |
| 22/07/2019 | 51.2 |
| 22/07/2019 | 43.3 |
| 22/07/2019 | 34.5 |
| 22/07/2019 | 27.1 |
| 22/07/2019 | 25.3 |
| 23/07/2019 | 23.1 |
| 23/07/2019 | 25.1 |
| 23/07/2019 | 25.9 |
| 23/07/2019 | 26.7 |
| 23/07/2019 | 31.1 |
| 23/07/2019 | 26.5 |
| 23/07/2019 | 24.5 |
| 23/07/2019 | 22.6 |
| 23/07/2019 | 23.7 |
| 23/07/2019 | 35 |
| 23/07/2019 | 41.6 |
| 23/07/2019 | 42.7 |
| 23/07/2019 | 45.2 |
| 23/07/2019 | 45.8 |
| 23/07/2019 | 44.9 |
| 23/07/2019 | 45.9 |
| 23/07/2019 | 44.7 |
| 23/07/2019 | 43.4 |
| 23/07/2019 | 42.9 |
| 23/07/2019 | 40.5 |
| 23/07/2019 | 38 |
| 23/07/2019 | 37.4 |
| 23/07/2019 | 36.9 |
| 23/07/2019 | 31.4 |
| 24/07/2019 | 27.8 |
| 24/07/2019 | 24.2 |
| 24/07/2019 | 21.1 |
| 24/07/2019 | 19.5 |
| 24/07/2019 | 21.8 |
| 24/07/2019 | 20.9 |
| 24/07/2019 | 21.4 |
| 24/07/2019 | 26.2 |
| 24/07/2019 | 28.3 |
| 24/07/2019 | 32.1 |
| 24/07/2019 | 36.5 |
| 24/07/2019 | 37.4 |
| 24/07/2019 | 36.1 |
| 24/07/2019 | 31.2 |
| 24/07/2019 | 34.7 |
| 24/07/2019 | 33.7 |
| 24/07/2019 | 31.3 |
| 24/07/2019 | 29.7 |
| 24/07/2019 | 37.1 |
| 24/07/2019 | 37.7 |
| 24/07/2019 | 33.2 |
| 24/07/2019 | 28.6 |
| 24/07/2019 | 25.6 |
| 24/07/2019 | 35.3 |
| 25/07/2019 | 24.2 |
| 25/07/2019 | 19.9 |
| 25/07/2019 | 21.9 |
| 25/07/2019 | 19.6 |
| 25/07/2019 | 20 |
| 25/07/2019 | 19.9 |
| 25/07/2019 | 21.8 |
| 25/07/2019 | 27.1 |
| 25/07/2019 | 29.4 |
| 25/07/2019 | 31.7 |
| 25/07/2019 | 33.9 |
| 25/07/2019 | 36.5 |
| 25/07/2019 | 39.2 |
| 25/07/2019 | 38.1 |
| 25/07/2019 | 38 |
| 25/07/2019 | 40.5 |
| 25/07/2019 | 40.3 |
| 25/07/2019 | 39.9 |
| 25/07/2019 | 35.4 |
| 25/07/2019 | 31.2 |
| 25/07/2019 | 27.9 |
| 25/07/2019 | 25.7 |
| 25/07/2019 | 21.8 |
| 25/07/2019 | 22.2 |
| 26/07/2019 | 21.6 |
| 26/07/2019 | 21.1 |
| 26/07/2019 | 20.8 |
| 26/07/2019 | 22.3 |
| 26/07/2019 | 23.4 |
| 26/07/2019 | 22.9 |
| 26/07/2019 | 22.2 |
| 26/07/2019 | 23 |
| 26/07/2019 | 23.2 |
| 26/07/2019 | 24.5 |
| 26/07/2019 | 25 |
| 26/07/2019 | 28.1 |
| 26/07/2019 | 27.7 |
| 26/07/2019 | 30.8 |
| 26/07/2019 | 33.7 |
| 26/07/2019 | 33.5 |
| 26/07/2019 | 32.2 |
| 26/07/2019 | 32.4 |
| 26/07/2019 | 31.8 |
| 26/07/2019 | 27.9 |
| 26/07/2019 | 21.1 |
| 26/07/2019 | 16.8 |
| 26/07/2019 | 17.2 |
| 26/07/2019 | 16 |
| 27/07/2019 | 14.3 |
| 27/07/2019 | 8.9 |
| 27/07/2019 | 7.7 |
| 27/07/2019 | 4.1 |
| 27/07/2019 | 6.5 |
| 27/07/2019 | 7.5 |
| 27/07/2019 | 8.9 |
| 27/07/2019 | 12.4 |
| 27/07/2019 | 16.1 |
| 27/07/2019 | 27.6 |
| 27/07/2019 | 32.5 |
| 27/07/2019 | 33.6 |
| 27/07/2019 | 36.2 |
| 27/07/2019 | 40.4 |
| 27/07/2019 | 43.3 |
| 27/07/2019 | 43.2 |
| 27/07/2019 | 44.3 |
| 27/07/2019 | 45.6 |
| 27/07/2019 | 44.4 |
| 27/07/2019 | 38.9 |
| 27/07/2019 | 33.3 |
| 27/07/2019 | 28.2 |
| 27/07/2019 | 27.6 |
| 27/07/2019 | 28.2 |
| 28/07/2019 | 32.7 |
| 28/07/2019 | 31.4 |
| 28/07/2019 | 31.3 |
| 28/07/2019 | 32 |
| 28/07/2019 | 31.8 |
| 28/07/2019 | 30.7 |
| 28/07/2019 | 31.5 |
| 28/07/2019 | 31.6 |
| 28/07/2019 | 31.9 |
| 28/07/2019 | 33.2 |
| 28/07/2019 | 34.5 |
| 28/07/2019 | 35.4 |
| 28/07/2019 | 36.4 |
| 28/07/2019 | 29 |
| 28/07/2019 | 29 |
| 28/07/2019 | 27.9 |
| 28/07/2019 | 27.6 |
| 28/07/2019 | 26.7 |
| 28/07/2019 | 25.5 |
| 28/07/2019 | 26 |
| 28/07/2019 | 25.2 |
| 28/07/2019 | 25.7 |
| 28/07/2019 | 21.7 |
| 28/07/2019 | 23.1 |
| 29/07/2019 | 25.1 |
| 29/07/2019 | 23.3 |
| 29/07/2019 | 20.1 |
| 29/07/2019 | 13.2 |
| 29/07/2019 | 12 |
| 29/07/2019 | 13 |
| 29/07/2019 | 12.8 |
| 29/07/2019 | 14.5 |
| 29/07/2019 | 17.8 |
| 29/07/2019 | 20.8 |
| 29/07/2019 | 21.8 |
| 29/07/2019 | 23.3 |
| 29/07/2019 | 25.7 |
| 29/07/2019 | 27.7 |
| 29/07/2019 | 28.4 |
| 29/07/2019 | 27.2 |
| 29/07/2019 | 28.5 |
| 29/07/2019 | 28.6 |
| 29/07/2019 | 30.4 |
| 29/07/2019 | 27.7 |
| 29/07/2019 | 22.5 |
| 29/07/2019 | 22.1 |
| 29/07/2019 | 22.5 |
| 29/07/2019 | 20.8 |
| 30/07/2019 | 19.1 |
| 30/07/2019 | 21.5 |
| 30/07/2019 | 20.3 |
| 30/07/2019 | 20.7 |
| 30/07/2019 | 23.8 |
| 30/07/2019 | 23.1 |
| 30/07/2019 | 21.5 |
| 30/07/2019 | 21.4 |
| 30/07/2019 | 25 |
| 30/07/2019 | 31.2 |
| 30/07/2019 | 33.1 |
| 30/07/2019 | 34.4 |
| 30/07/2019 | 35.8 |
| 30/07/2019 | 38.9 |
| 30/07/2019 | 39.4 |
| 30/07/2019 | 39.1 |
| 30/07/2019 | 39 |
| 30/07/2019 | 42.1 |
| 30/07/2019 | 43.9 |
| 30/07/2019 | 41.9 |
| 30/07/2019 | 38.2 |
| 30/07/2019 | 32.7 |
| 30/07/2019 | 31.6 |
| 30/07/2019 | 29.7 |
| 31/07/2019 | 27.3 |
| 31/07/2019 | 26.1 |
| 31/07/2019 | 23.7 |
| 31/07/2019 | 21.4 |
| 31/07/2019 | 18 |
| 31/07/2019 | 15.6 |
| 31/07/2019 | 14.6 |
| 31/07/2019 | 16.3 |
| 31/07/2019 | 22.8 |
| 31/07/2019 | 25.2 |
| 31/07/2019 | 34.9 |
| 31/07/2019 | 34.3 |
| 31/07/2019 | 29.5 |
| 31/07/2019 | 43.6 |
| 31/07/2019 | 47.4 |
| 31/07/2019 | 49.2 |
| 31/07/2019 | 48.4 |
| 31/07/2019 | 48.6 |
| 31/07/2019 | 48.2 |
| 31/07/2019 | 45.2 |
| 31/07/2019 | 37.6 |
| 31/07/2019 | 31 |
| 31/07/2019 | 28.9 |
| 31/07/2019 | 30 |
| 01/08/2019 | 28.9 |
| 01/08/2019 | 24.3 |
| 01/08/2019 | 21.5 |
| 01/08/2019 | 20.3 |
| 01/08/2019 | 22.3 |
| 01/08/2019 | 18.7 |
| 01/08/2019 | 16.6 |
| 01/08/2019 | 18.1 |
| 01/08/2019 | 20.2 |
| 01/08/2019 | 22.9 |
| 01/08/2019 | 27.6 |
| 01/08/2019 | 34.8 |
| 01/08/2019 | 35.7 |
| 01/08/2019 | 35.9 |
| 01/08/2019 | 44.9 |
| 01/08/2019 | 40.8 |
| 01/08/2019 | 43.9 |
| 01/08/2019 | 43.9 |
| 01/08/2019 | 44.1 |
| 01/08/2019 | 39.9 |
| 01/08/2019 | 35 |
| 01/08/2019 | 35.6 |
| 01/08/2019 | 32.5 |
| 01/08/2019 | 27 |
| 02/08/2019 | 25.3 |
| 02/08/2019 | 24.7 |
| 02/08/2019 | 24.4 |
| 02/08/2019 | 23 |
| 02/08/2019 | 21 |
| 02/08/2019 | 19.4 |
| 02/08/2019 | 19 |
| 02/08/2019 | 21.1 |
| 02/08/2019 | 25.1 |
| 02/08/2019 | 29.6 |
| 02/08/2019 | 36.9 |
| 02/08/2019 | 42.9 |
| 02/08/2019 | 46.8 |
| 02/08/2019 | 47 |
| 02/08/2019 | 48.9 |
| 02/08/2019 | 49.4 |
| 02/08/2019 | 48.4 |
| 02/08/2019 | 50.4 |
| 02/08/2019 | 51.2 |
| 02/08/2019 | 46.5 |
| 02/08/2019 | 42.8 |
| 02/08/2019 | 41 |
| 02/08/2019 | 35.8 |
| 02/08/2019 | 31.3 |
| 03/08/2019 | 27.2 |
| 03/08/2019 | 27.8 |
| 03/08/2019 | 28.6 |
| 03/08/2019 | 29.1 |
| 03/08/2019 | 26.8 |
| 03/08/2019 | 20.4 |
| 03/08/2019 | 19.9 |
| 03/08/2019 | 24 |
| 03/08/2019 | 32.3 |
| 03/08/2019 | 37.2 |
| 03/08/2019 | 41.6 |
| 03/08/2019 | 45.3 |
| 03/08/2019 | 45.6 |
| 03/08/2019 | 35.1 |
| 03/08/2019 | 37.2 |
| 03/08/2019 | 46.2 |
| 03/08/2019 | 46.7 |
| 03/08/2019 | 45 |
| 03/08/2019 | 45.4 |
| 03/08/2019 | 44 |
| 03/08/2019 | 40.4 |
| 03/08/2019 | 38.9 |
| 03/08/2019 | 36.1 |
| 03/08/2019 | 31.6 |
| 04/08/2019 | 29.4 |
| 04/08/2019 | 26.6 |
| 04/08/2019 | 20.9 |
| 04/08/2019 | 17.4 |
| 04/08/2019 | 14.8 |
| 04/08/2019 | 12.3 |
| 04/08/2019 | 9.8 |
| 04/08/2019 | 16.3 |
| 04/08/2019 | 21.5 |
| 04/08/2019 | 24.5 |
| 04/08/2019 | 35.7 |
| 04/08/2019 | 35.4 |
| 04/08/2019 | 35.5 |
| 04/08/2019 | 35.6 |
| 04/08/2019 | 37.4 |
| 04/08/2019 | 38.9 |
| 04/08/2019 | 40.4 |
| 04/08/2019 | 40.1 |
| 04/08/2019 | 39.6 |
| 04/08/2019 | 36.7 |
| 04/08/2019 | 29.1 |
| 04/08/2019 | 25.5 |
| 04/08/2019 | 26.2 |
| 04/08/2019 | 26.6 |
| 05/08/2019 | 22.5 |
| 05/08/2019 | 19.8 |
| 05/08/2019 | 14.9 |
| 05/08/2019 | 16.6 |
| 05/08/2019 | 14.6 |
| 05/08/2019 | 9.8 |
| 05/08/2019 | 8.3 |
| 05/08/2019 | 14 |
| 05/08/2019 | 25.7 |
| 05/08/2019 | 29 |
| 05/08/2019 | 30.1 |
| 05/08/2019 | 30.4 |
| 05/08/2019 | 25.6 |
| 05/08/2019 | 25.8 |
| 05/08/2019 | 26.6 |
| 05/08/2019 | 27.9 |
| 05/08/2019 | 28.3 |
| 05/08/2019 | 29.7 |
| 05/08/2019 | 29.4 |
| 05/08/2019 | 27.9 |
| 05/08/2019 | 18.2 |
| 05/08/2019 | 13.4 |
| 05/08/2019 | 8.5 |
| 05/08/2019 | 7.5 |
| 06/08/2019 | 8.4 |
| 06/08/2019 | 9.5 |
| 06/08/2019 | 12.8 |
| 06/08/2019 | 9.9 |
| 06/08/2019 | 19.5 |
| 06/08/2019 | 15.9 |
| 06/08/2019 | 15.2 |
| 06/08/2019 | 22.1 |
| 06/08/2019 | 28.8 |
| 06/08/2019 | 32.6 |
| 06/08/2019 | 35 |
| 06/08/2019 | 35.4 |
| 06/08/2019 | 30.1 |
| 06/08/2019 | 29.6 |
| 06/08/2019 | 29.7 |
| 06/08/2019 | 31.4 |
| 06/08/2019 | 29.4 |
| 06/08/2019 | 27.2 |
| 06/08/2019 | 25.3 |
| 06/08/2019 | 23.6 |
| 06/08/2019 | 21.9 |
| 06/08/2019 | 20.1 |
| 06/08/2019 | 17.8 |
| 06/08/2019 | 15.5 |
| 07/08/2019 | 14.5 |
| 07/08/2019 | 12.9 |
| 07/08/2019 | 11.9 |
| 07/08/2019 | 12.3 |
| 07/08/2019 | 12.2 |
| 07/08/2019 | 11.3 |
| 07/08/2019 | 10.8 |
| 07/08/2019 | 11.8 |
| 07/08/2019 | 12.7 |
| 07/08/2019 | 15.1 |
| 07/08/2019 | 22.3 |
| 07/08/2019 | 23.3 |
| 07/08/2019 | 24.5 |
| 07/08/2019 | 25.7 |
| 07/08/2019 | 26.5 |
| 07/08/2019 | 27.6 |
| 07/08/2019 | 28 |
| 07/08/2019 | 28.6 |
| 07/08/2019 | 30.7 |
| 07/08/2019 | 28.8 |
| 07/08/2019 | 26.9 |
| 07/08/2019 | 25.8 |
| 07/08/2019 | 25.1 |
| 07/08/2019 | 20.8 |
| 08/08/2019 | 18.8 |
| 08/08/2019 | 14.4 |
| 08/08/2019 | 12.4 |
| 08/08/2019 | 13.1 |
| 08/08/2019 | 12.5 |
| 08/08/2019 | 7.6 |
| 08/08/2019 | 4 |
| 08/08/2019 | 8.2 |
| 08/08/2019 | 19.3 |
| 08/08/2019 | 24 |
| 08/08/2019 | 29.8 |
| 08/08/2019 | 31.5 |
| 08/08/2019 | 33.1 |
| 08/08/2019 | 34 |
| 08/08/2019 | 33.6 |
| 08/08/2019 | 34 |
| 08/08/2019 | 34.6 |
| 08/08/2019 | 35.3 |
| 08/08/2019 | 35.6 |
| 08/08/2019 | 31.9 |
| 08/08/2019 | 24.2 |
| 08/08/2019 | 23.3 |
| 08/08/2019 | 22.5 |
| 08/08/2019 | 27.3 |
| 09/08/2019 | 23.2 |
| 09/08/2019 | 19.6 |
| 09/08/2019 | 22.3 |
| 09/08/2019 | 21.3 |
| 09/08/2019 | 19.7 |
| 09/08/2019 | 12.4 |
| 09/08/2019 | 11.7 |
| 09/08/2019 | 15.2 |
| 09/08/2019 | 21.5 |
| 09/08/2019 | 29.2 |
| 09/08/2019 | 35.6 |
| 09/08/2019 | 37.5 |
| 09/08/2019 | 38.1 |
| 09/08/2019 | 37.3 |
| 09/08/2019 | 37.5 |
| 09/08/2019 | 39.7 |
| 09/08/2019 | 40.8 |
| 09/08/2019 | 42.5 |
| 09/08/2019 | 39.7 |
| 09/08/2019 | 36.9 |
| 09/08/2019 | 31.6 |
| 09/08/2019 | 26.6 |
| 09/08/2019 | 22.5 |
| 09/08/2019 | 21.5 |
| 10/08/2019 | 17.1 |
| 10/08/2019 | 18.2 |
| 10/08/2019 | 14.3 |
| 10/08/2019 | 20.3 |
| 10/08/2019 | 27.3 |
| 10/08/2019 | 27.6 |
| 10/08/2019 | 30.1 |
| 10/08/2019 | 28.8 |
| 10/08/2019 | 27.5 |
| 10/08/2019 | 20.9 |
| 10/08/2019 | 23.6 |
| 10/08/2019 | 24.6 |
| 10/08/2019 | 23.9 |
| 10/08/2019 | 19.7 |
| 10/08/2019 | 13.5 |
| 10/08/2019 | 11.4 |
| 10/08/2019 | 10.3 |
| 10/08/2019 | 12.5 |
| 10/08/2019 | 12.8 |
| 10/08/2019 | 9.7 |
| 10/08/2019 | 7 |
| 10/08/2019 | 2.7 |
| 10/08/2019 | 1.7 |
| 10/08/2019 | 3.9 |
| 11/08/2019 | 3.6 |
| 11/08/2019 | 4.2 |
| 11/08/2019 | 5.4 |
| 11/08/2019 | 10.8 |
| 11/08/2019 | 9 |
| 11/08/2019 | 8.2 |
| 11/08/2019 | 8.2 |
| 11/08/2019 | 9.4 |
| 11/08/2019 | 12.7 |
| 11/08/2019 | 16.1 |
| 11/08/2019 | 18.6 |
| 11/08/2019 | 21.7 |
| 11/08/2019 | 24.5 |
| 11/08/2019 | 25.7 |
| 11/08/2019 | 28.4 |
| 11/08/2019 | 30.4 |
| 11/08/2019 | 28.5 |
| 11/08/2019 | 27.7 |
| 11/08/2019 | 26.4 |
| 11/08/2019 | 25 |
| 11/08/2019 | 21.9 |
| 11/08/2019 | 20.1 |
| 11/08/2019 | 20.4 |
| 11/08/2019 | 18.2 |
| 12/08/2019 | 17.5 |
| 12/08/2019 | 15.9 |
| 12/08/2019 | 14.4 |
| 12/08/2019 | 13.5 |
| 12/08/2019 | 11.9 |
| 12/08/2019 | 11.5 |
| 12/08/2019 | 10.8 |
| 12/08/2019 | 10 |
| 12/08/2019 | 9.8 |
| 12/08/2019 | 9.2 |
| 12/08/2019 | 12.3 |
| 12/08/2019 | 19.1 |
| 12/08/2019 | 19.1 |
| 12/08/2019 | 17.1 |
| 12/08/2019 | 15.4 |
| 12/08/2019 | 15.4 |
| 12/08/2019 | 16.4 |
| 12/08/2019 | 17.7 |
| 12/08/2019 | 19.1 |
| 12/08/2019 | 18.3 |
| 12/08/2019 | 19.2 |
| 12/08/2019 | 19.4 |
| 12/08/2019 | 20.8 |
| 12/08/2019 | 21.5 |
| 13/08/2019 | 21.2 |
| 13/08/2019 | 17.7 |
| 13/08/2019 | 15.1 |
| 13/08/2019 | 12.7 |
| 13/08/2019 | 10.5 |
| 13/08/2019 | 11.3 |
| 13/08/2019 | 12.5 |
| 13/08/2019 | 13.4 |
| 13/08/2019 | 18.7 |
| 13/08/2019 | 17.8 |
| 13/08/2019 | 19.8 |
| 13/08/2019 | 20.7 |
| 13/08/2019 | 22.5 |
| 13/08/2019 | 24.9 |
| 13/08/2019 | 28 |
| 13/08/2019 | 28.9 |
| 13/08/2019 | 29.1 |
| 13/08/2019 | 27.7 |
| 13/08/2019 | 26.1 |
| 13/08/2019 | 24.4 |
| 13/08/2019 | 15.9 |
| 13/08/2019 | 7.4 |
| 13/08/2019 | 7.5 |
| 13/08/2019 | 9.9 |
| 14/08/2019 | 12.7 |
| 14/08/2019 | 11.2 |
| 14/08/2019 | 8.7 |
| 14/08/2019 | 8.4 |
| 14/08/2019 | 9.8 |
| 14/08/2019 | 9.4 |
| 14/08/2019 | 11 |
| 14/08/2019 | 8.5 |
| 14/08/2019 | 15.2 |
| 14/08/2019 | 19.9 |
| 14/08/2019 | 26.1 |
| 14/08/2019 | 28.1 |
| 14/08/2019 | 30 |
| 14/08/2019 | 29.6 |
| 14/08/2019 | 28.3 |
| 14/08/2019 | 29.3 |
| 14/08/2019 | 32.3 |
| 14/08/2019 | 29.7 |
| 14/08/2019 | 25.8 |
| 14/08/2019 | 23.3 |
| 14/08/2019 | 20.2 |
| 14/08/2019 | 11.9 |
| 14/08/2019 | 12.7 |
| 14/08/2019 | 10.1 |
| 15/08/2019 | 10 |
| 15/08/2019 | 15.5 |
| 15/08/2019 | 14.8 |
| 15/08/2019 | 11.6 |
| 15/08/2019 | 13.5 |
| 15/08/2019 | 8 |
| 15/08/2019 | 6.8 |
| 15/08/2019 | 7.7 |
| 15/08/2019 | 12.7 |
| 15/08/2019 | 23.3 |
| 15/08/2019 | 30.2 |
| 15/08/2019 | 33.3 |
| 15/08/2019 | 35.1 |
| 15/08/2019 | 36.4 |
| 15/08/2019 | 38.1 |
| 15/08/2019 | 38.6 |
| 15/08/2019 | 37.7 |
| 15/08/2019 | 38.6 |
| 15/08/2019 | 35.3 |
| 15/08/2019 | 38.2 |
| 15/08/2019 | 29.2 |
| 15/08/2019 | 24.5 |
| 15/08/2019 | 21.1 |
| 15/08/2019 | 20.5 |
| 16/08/2019 | 18.1 |
| 16/08/2019 | 13.7 |
| 16/08/2019 | 10.5 |
| 16/08/2019 | 9.8 |
| 16/08/2019 | 9.2 |
| 16/08/2019 | 5.5 |
| 16/08/2019 | 6.3 |
| 16/08/2019 | 7.4 |
| 16/08/2019 | 11.3 |
| 16/08/2019 | 16.7 |
| 16/08/2019 | 21.5 |
| 16/08/2019 | 35.9 |
| 16/08/2019 | 43.4 |
| 16/08/2019 | 39.2 |
| 16/08/2019 | 41.9 |
| 16/08/2019 | 40 |
| 16/08/2019 | 39.3 |
| 16/08/2019 | 38.7 |
| 16/08/2019 | 36.2 |
| 16/08/2019 | 32.6 |
| 16/08/2019 | 25.1 |
| 16/08/2019 | 22.5 |
| 16/08/2019 | 24 |
| 16/08/2019 | 22 |
| 17/08/2019 | 20.5 |
| 17/08/2019 | 24 |
| 17/08/2019 | 21 |
| 17/08/2019 | 19.6 |
| 17/08/2019 | 17.9 |
| 17/08/2019 | 14.8 |
| 17/08/2019 | 13.4 |
| 17/08/2019 | 15.3 |
| 17/08/2019 | 17.4 |
| 17/08/2019 | 17.2 |
| 17/08/2019 | 17.5 |
| 17/08/2019 | 18.4 |
| 17/08/2019 | 18.7 |
| 17/08/2019 | 21.1 |
| 17/08/2019 | 23.6 |
| 17/08/2019 | 24.7 |
| 17/08/2019 | 24 |
| 17/08/2019 | 24.2 |
| 17/08/2019 | 25 |
| 17/08/2019 | 23.6 |
| 17/08/2019 | 21.7 |
| 17/08/2019 | 18 |
| 17/08/2019 | 15.2 |
| 17/08/2019 | 15.6 |
| 18/08/2019 | 15.3 |
| 18/08/2019 | 14.9 |
| 18/08/2019 | 16 |
| 18/08/2019 | 15.2 |
| 18/08/2019 | 13.7 |
| 18/08/2019 | 12.1 |
| 18/08/2019 | 11.6 |
| 18/08/2019 | 12.4 |
| 18/08/2019 | 15.9 |
| 18/08/2019 | 19.8 |
| 18/08/2019 | 24.1 |
| 18/08/2019 | 28.5 |
| 18/08/2019 | 29.5 |
| 18/08/2019 | 29.5 |
| 18/08/2019 | 29.4 |
| 18/08/2019 | 30 |
| 18/08/2019 | 30.1 |
| 18/08/2019 | 28.9 |
| 18/08/2019 | 28.5 |
| 18/08/2019 | 25.5 |
| 18/08/2019 | 13.9 |
| 18/08/2019 | 14.8 |
| 18/08/2019 | 19 |
| 18/08/2019 | 14.9 |
| 19/08/2019 | 16 |
| 19/08/2019 | 13.1 |
| 19/08/2019 | 10.8 |
| 19/08/2019 | 8 |
| 19/08/2019 | 8.7 |
| 19/08/2019 | 4.5 |
| 19/08/2019 | 2 |
| 19/08/2019 | 4.5 |
| 19/08/2019 | 13.6 |
| 19/08/2019 | 18.6 |
| 19/08/2019 | 25.6 |
| 19/08/2019 | 29.3 |
| 19/08/2019 | 29.6 |
| 19/08/2019 | 32.8 |
| 19/08/2019 | 39.3 |
| 19/08/2019 | 50.2 |
| 19/08/2019 | 45.4 |
| 19/08/2019 | 39.2 |
| 19/08/2019 | 37.4 |
| 19/08/2019 | 35.1 |
| 19/08/2019 | 31 |
| 19/08/2019 | 26.6 |
| 19/08/2019 | 23.2 |
| 19/08/2019 | 23.3 |
| 20/08/2019 | 20.5 |
| 20/08/2019 | 21.1 |
| 20/08/2019 | 19.4 |
| 20/08/2019 | 16.4 |
| 20/08/2019 | 14.5 |
| 20/08/2019 | 9.9 |
| 20/08/2019 | 8.7 |
| 20/08/2019 | 11.7 |
| 20/08/2019 | 14.8 |
| 20/08/2019 | 20.3 |
| 20/08/2019 | 23.8 |
| 20/08/2019 | 25.8 |
| 20/08/2019 | 26 |
| 20/08/2019 | 25.6 |
| 20/08/2019 | 26 |
| 20/08/2019 | 26.6 |
| 20/08/2019 | 28.2 |
| 20/08/2019 | 28.6 |
| 20/08/2019 | 28.2 |
| 20/08/2019 | 24.6 |
| 20/08/2019 | 13.6 |
| 20/08/2019 | 14.3 |
| 20/08/2019 | 14.6 |
| 20/08/2019 | 11.3 |
| 21/08/2019 | 7.7 |
| 21/08/2019 | 12.7 |
| 21/08/2019 | 12.4 |
| 21/08/2019 | 7 |
| 21/08/2019 | 4.7 |
| 21/08/2019 | 5.9 |
| 21/08/2019 | 1.5 |
| 21/08/2019 | 7.1 |
| 21/08/2019 | 12 |
| 21/08/2019 | 18.7 |
| 21/08/2019 | 23.4 |
| 21/08/2019 | 29.5 |
| 21/08/2019 | 32.2 |
| 21/08/2019 | 33.5 |
| 21/08/2019 | 28 |
| 21/08/2019 | 33.7 |
| 21/08/2019 | 36.9 |
| 21/08/2019 | 32.2 |
| 21/08/2019 | 29.1 |
| 21/08/2019 | 23.2 |
| 21/08/2019 | 21 |
| 21/08/2019 | 22.1 |
| 21/08/2019 | 22.4 |
| 21/08/2019 | 22.1 |
| 22/08/2019 | 21.5 |
| 22/08/2019 | 19.3 |
| 22/08/2019 | 17.8 |
| 22/08/2019 | 15.7 |
| 22/08/2019 | 13.6 |
| 22/08/2019 | 12.3 |
| 22/08/2019 | 11.5 |
| 22/08/2019 | 11.3 |
| 22/08/2019 | 13.5 |
| 22/08/2019 | 16.3 |
| 22/08/2019 | 20.6 |
| 22/08/2019 | 25.9 |
| 22/08/2019 | 30.2 |
| 22/08/2019 | 32.5 |
| 22/08/2019 | 33.9 |
| 22/08/2019 | 36.5 |
| 22/08/2019 | 36.4 |
| 22/08/2019 | 37 |
| 22/08/2019 | 36.1 |
| 22/08/2019 | 33.5 |
| 22/08/2019 | 28.9 |
| 22/08/2019 | 26.4 |
| 22/08/2019 | 25.9 |
| 22/08/2019 | 24.7 |
| 23/08/2019 | 23.5 |
| 23/08/2019 | 22.4 |
| 23/08/2019 | 20.3 |
| 23/08/2019 | 16.9 |
| 23/08/2019 | 17.4 |
| 23/08/2019 | 16.7 |
| 23/08/2019 | 14.1 |
| 23/08/2019 | 14.3 |
| 23/08/2019 | 15 |
| 23/08/2019 | 15.7 |
| 23/08/2019 | 15.8 |
| 23/08/2019 | 16.5 |
| 23/08/2019 | 17.6 |
| 23/08/2019 | 22.2 |
| 23/08/2019 | 26.9 |
| 23/08/2019 | 20.6 |
| 23/08/2019 | 33.3 |
| 23/08/2019 | 35.3 |
| 23/08/2019 | 30.3 |
| 23/08/2019 | 28.1 |
| 23/08/2019 | 27.6 |
| 23/08/2019 | 23.6 |
| 23/08/2019 | 22.1 |
| 23/08/2019 | 18.2 |
| 24/08/2019 | 17.3 |
| 24/08/2019 | 16.3 |
| 24/08/2019 | 15.3 |
| 24/08/2019 | 18 |
| 24/08/2019 | 16.8 |
| 24/08/2019 | 16.2 |
| 24/08/2019 | 14.3 |
| 24/08/2019 | 15.2 |
| 24/08/2019 | 15.6 |
| 24/08/2019 | 12.9 |
| 24/08/2019 | 29.3 |
| 24/08/2019 | 36.1 |
| 24/08/2019 | 40.8 |
| 24/08/2019 | 40.8 |
| 24/08/2019 | 41.6 |
| 24/08/2019 | 42.7 |
| 24/08/2019 | 44.3 |
| 24/08/2019 | 42 |
| 24/08/2019 | 37.5 |
| 24/08/2019 | 36.1 |
| 24/08/2019 | 29.7 |
| 24/08/2019 | 39.3 |
| 24/08/2019 | 41.1 |
| 24/08/2019 | 29.1 |
| 25/08/2019 | 28.9 |
| 25/08/2019 | 27.3 |
| 25/08/2019 | 26 |
| 25/08/2019 | 28.6 |
| 25/08/2019 | 23.5 |
| 25/08/2019 | 17.4 |
| 25/08/2019 | 13.1 |
| 25/08/2019 | 8.6 |
| 25/08/2019 | 10.9 |
| 25/08/2019 | 11.9 |
| 25/08/2019 | 22.4 |
| 25/08/2019 | 30 |
| 25/08/2019 | 36.8 |
| 25/08/2019 | 35.7 |
| 25/08/2019 | 34.4 |
| 25/08/2019 | 33.5 |
| 25/08/2019 | 34.1 |
| 25/08/2019 | 34.7 |
| 25/08/2019 | 33.6 |
| 25/08/2019 | 34.5 |
| 25/08/2019 | 31.5 |
| 25/08/2019 | 32.6 |
| 25/08/2019 | 22.7 |
| 25/08/2019 | 18 |
| 26/08/2019 | 15.1 |
| 26/08/2019 | 14.9 |
| 26/08/2019 | 15.6 |
| 26/08/2019 | 14.2 |
| 26/08/2019 | 14.5 |
| 26/08/2019 | 14.1 |
| 26/08/2019 | 11.8 |
| 26/08/2019 | 13.8 |
| 26/08/2019 | 16.9 |
| 26/08/2019 | 18.2 |
| 26/08/2019 | 24.1 |
| 26/08/2019 | 25.3 |
| 26/08/2019 | 26.2 |
| 26/08/2019 | 26.9 |
| 26/08/2019 | 26.3 |
| 26/08/2019 | 26.3 |
| 26/08/2019 | 26.6 |
| 26/08/2019 | 28 |
| 26/08/2019 | 31.1 |
| 26/08/2019 | 32.3 |
| 26/08/2019 | 29.9 |
| 26/08/2019 | 23.2 |
| 26/08/2019 | 21 |
| 26/08/2019 | 21.2 |
| 27/08/2019 | 19.6 |
| 27/08/2019 | 19.5 |
| 27/08/2019 | 19.7 |
| 27/08/2019 | 19.8 |
| 27/08/2019 | 18.5 |
| 27/08/2019 | 16.7 |
| 27/08/2019 | 15.9 |
| 27/08/2019 | 15.5 |
| 27/08/2019 | 15.4 |
| 27/08/2019 | 17.2 |
| 27/08/2019 | 17.3 |
| 27/08/2019 | 16.9 |
| 27/08/2019 | 18.1 |
| 27/08/2019 | 18.2 |
| 27/08/2019 | 18.3 |
| 27/08/2019 | 20.1 |
| 27/08/2019 | 21.1 |
| 27/08/2019 | 23.2 |
| 27/08/2019 | 22.4 |
| 27/08/2019 | 24.7 |
| 27/08/2019 | 19.3 |
| 27/08/2019 | 15.9 |
| 27/08/2019 | 15.2 |
| 27/08/2019 | 10.8 |
| 28/08/2019 | 9.2 |
| 28/08/2019 | 9.2 |
| 28/08/2019 | 7.4 |
| 28/08/2019 | 7.4 |
| 28/08/2019 | 5.9 |
| 28/08/2019 | 5.7 |
| 28/08/2019 | 5.7 |
| 28/08/2019 | 7.3 |
| 28/08/2019 | 11.3 |
| 28/08/2019 | 16.9 |
| 28/08/2019 | 25.4 |
| 28/08/2019 | 31.1 |
| 28/08/2019 | 34 |
| 28/08/2019 | 35.2 |
| 28/08/2019 | 36.3 |
| 28/08/2019 | 37.2 |
| 28/08/2019 | 35.7 |
| 28/08/2019 | 29.4 |
| 28/08/2019 | 29.2 |
| 28/08/2019 | 26.5 |
| 28/08/2019 | 21.5 |
| 28/08/2019 | 19.1 |
| 28/08/2019 | 20.5 |
| 28/08/2019 | 25.9 |
| 29/08/2019 | 26.4 |
| 29/08/2019 | 24.8 |
| 29/08/2019 | 24 |
| 29/08/2019 | 21.9 |
| 29/08/2019 | 20 |
| 29/08/2019 | 18.9 |
| 29/08/2019 | 17.2 |
| 29/08/2019 | 16.8 |
| 29/08/2019 | 17.2 |
| 29/08/2019 | 20 |
| 29/08/2019 | 21.4 |
| 29/08/2019 | 21.5 |
| 29/08/2019 | 22.3 |
| 29/08/2019 | 23.6 |
| 29/08/2019 | 24.7 |
| 29/08/2019 | 25.4 |
| 29/08/2019 | 26.5 |
| 29/08/2019 | 26.9 |
| 29/08/2019 | 25.7 |
| 29/08/2019 | 24.2 |
| 29/08/2019 | 22.7 |
| 29/08/2019 | 20.8 |
| 29/08/2019 | 15.5 |
| 29/08/2019 | 12.6 |
| 30/08/2019 | 10.1 |
| 30/08/2019 | 7.9 |
| 30/08/2019 | 8.7 |
| 30/08/2019 | 7.1 |
| 30/08/2019 | 5.8 |
| 30/08/2019 | 2 |
| 30/08/2019 | 1.2 |
| 30/08/2019 | 2.1 |
| 30/08/2019 | 5.5 |
| 30/08/2019 | 13.3 |
| 30/08/2019 | 17 |
| 30/08/2019 | 18.4 |
| 30/08/2019 | 24.5 |
| 30/08/2019 | 26.3 |
| 30/08/2019 | 27.3 |
| 30/08/2019 | 24.4 |
| 30/08/2019 | 24.4 |
| 30/08/2019 | 24.4 |
| 30/08/2019 | 24.3 |
| 30/08/2019 | 22 |
| 30/08/2019 | 21.2 |
| 30/08/2019 | 19.3 |
| 30/08/2019 | 20.5 |
| 30/08/2019 | 20.1 |
| 31/08/2019 | 20.1 |
| 31/08/2019 | 15.8 |
| 31/08/2019 | 11.2 |
| 31/08/2019 | 10.1 |
| 31/08/2019 | 7.2 |
| 31/08/2019 | 6 |
| 31/08/2019 | 5.6 |
| 31/08/2019 | 7.9 |
| 31/08/2019 | 14.3 |
| 31/08/2019 | 18.8 |
| 31/08/2019 | 26.7 |
| 31/08/2019 | 31.6 |
| 31/08/2019 | 34.2 |
| 31/08/2019 | 37.9 |
| 31/08/2019 | 38.5 |
| 31/08/2019 | 39 |
| 31/08/2019 | 34.7 |
| 31/08/2019 | 32.4 |
| 31/08/2019 | 32.3 |
| 31/08/2019 | 29.9 |
| 31/08/2019 | 28.8 |
| 31/08/2019 | 24.2 |
| 31/08/2019 | 19.2 |
| 31/08/2019 | 16.1 |